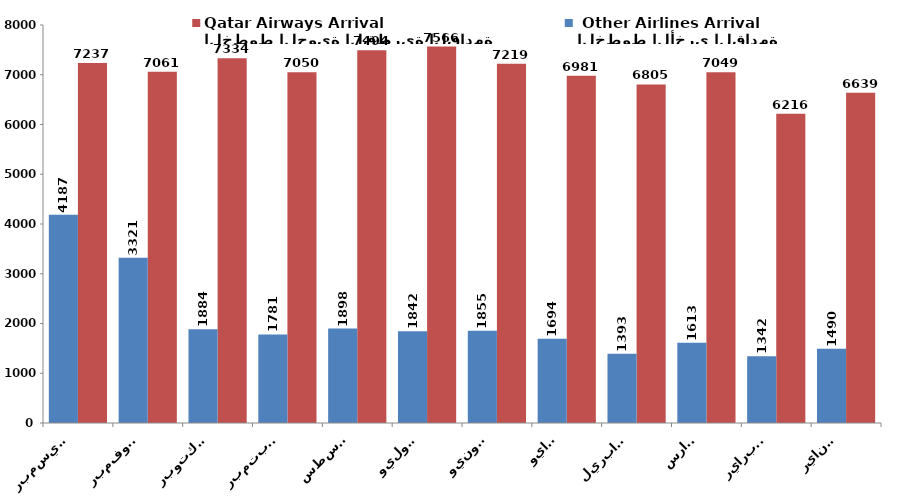
| Category | الخطوط الجوية القطرية القادمة
Qatar Airways Arrival | الخطوط الأخرى القادمة
 Other Airlines Arrival |
|---|---|---|
|   يناير
January | 6639 | 1490 |
|   فبراير
 February | 6216 | 1342 |
|   مارس
  March | 7049 | 1613 |
|   ابريل 
 April | 6805 | 1393 |
|   مايو
  May | 6981 | 1694 |
|   يونيو 
 June | 7219 | 1855 |
|   يوليو
  July | 7566 | 1842 |
|   أغسطس
  August | 7494 | 1898 |
|   سبتمبر
September | 7050 | 1781 |
|   أكتوبر
  October | 7334 | 1884 |
|   نوفمبر
  November | 7061 | 3321 |
|   ديسمبر
  December | 7237 | 4187 |